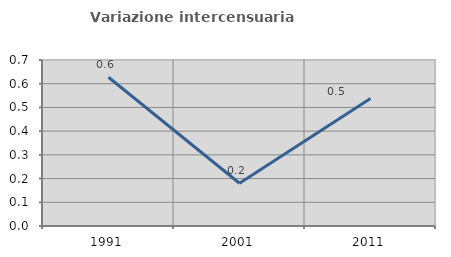
| Category | Variazione intercensuaria annua |
|---|---|
| 1991.0 | 0.627 |
| 2001.0 | 0.18 |
| 2011.0 | 0.537 |